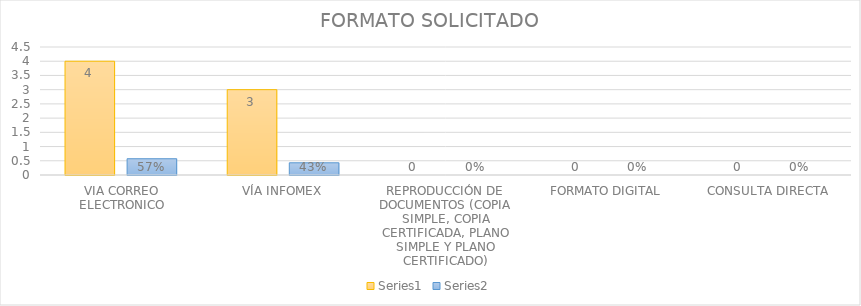
| Category | Series 3 | Series 4 |
|---|---|---|
| VIA CORREO ELECTRONICO | 4 | 0.571 |
| VÍA INFOMEX | 3 | 0.429 |
| REPRODUCCIÓN DE DOCUMENTOS (COPIA SIMPLE, COPIA CERTIFICADA, PLANO SIMPLE Y PLANO CERTIFICADO) | 0 | 0 |
| FORMATO DIGITAL | 0 | 0 |
| CONSULTA DIRECTA | 0 | 0 |